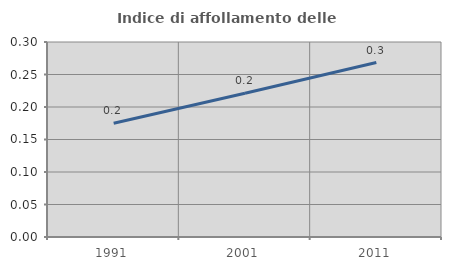
| Category | Indice di affollamento delle abitazioni  |
|---|---|
| 1991.0 | 0.175 |
| 2001.0 | 0.221 |
| 2011.0 | 0.268 |